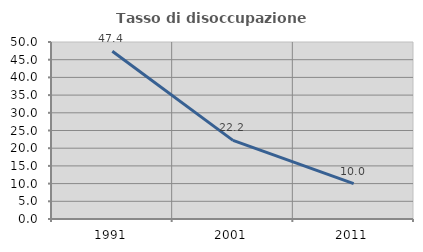
| Category | Tasso di disoccupazione giovanile  |
|---|---|
| 1991.0 | 47.368 |
| 2001.0 | 22.222 |
| 2011.0 | 10 |